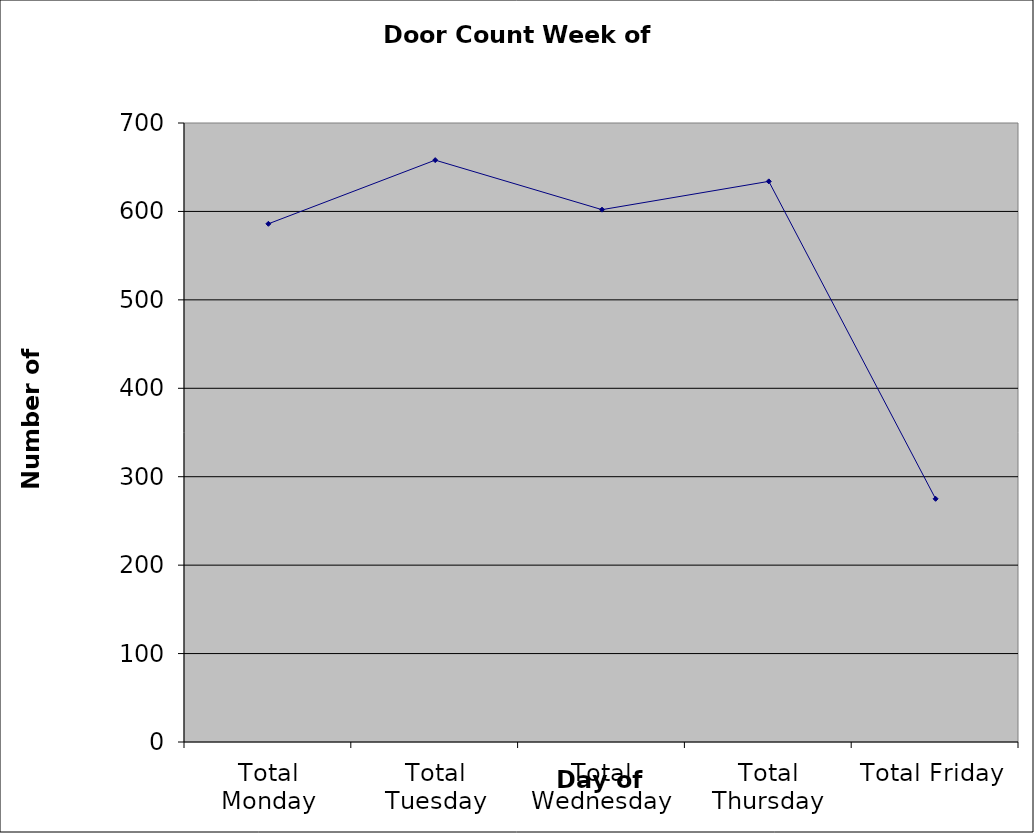
| Category | Series 0 |
|---|---|
| Total Monday | 586 |
| Total Tuesday | 658 |
| Total Wednesday | 602 |
| Total Thursday | 634 |
| Total Friday | 275 |